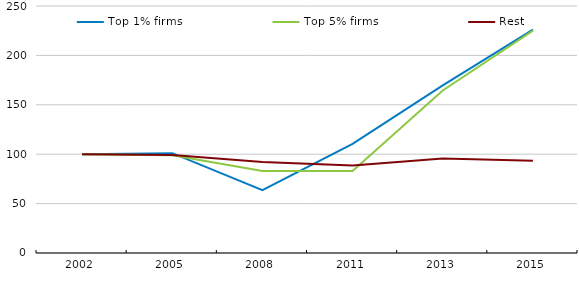
| Category | Top 1% firms | Top 5% firms | Rest |
|---|---|---|---|
| 2002.0 | 100 | 100 | 100 |
| 2005.0 | 101.03 | 98.834 | 99.198 |
| 2008.0 | 63.714 | 83.061 | 92.127 |
| 2011.0 | 110.503 | 83.095 | 88.509 |
| 2013.0 | 169.652 | 164.499 | 95.724 |
| 2015.0 | 226.179 | 224.991 | 93.335 |